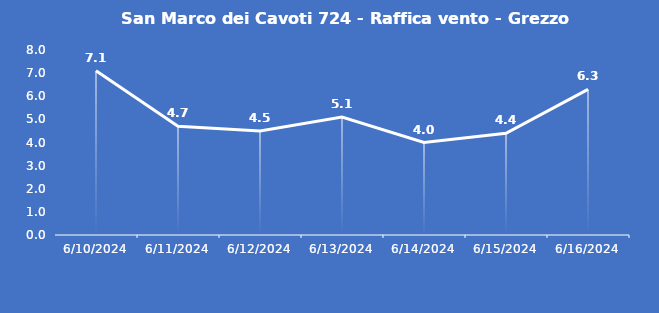
| Category | San Marco dei Cavoti 724 - Raffica vento - Grezzo (m/s) |
|---|---|
| 6/10/24 | 7.1 |
| 6/11/24 | 4.7 |
| 6/12/24 | 4.5 |
| 6/13/24 | 5.1 |
| 6/14/24 | 4 |
| 6/15/24 | 4.4 |
| 6/16/24 | 6.3 |